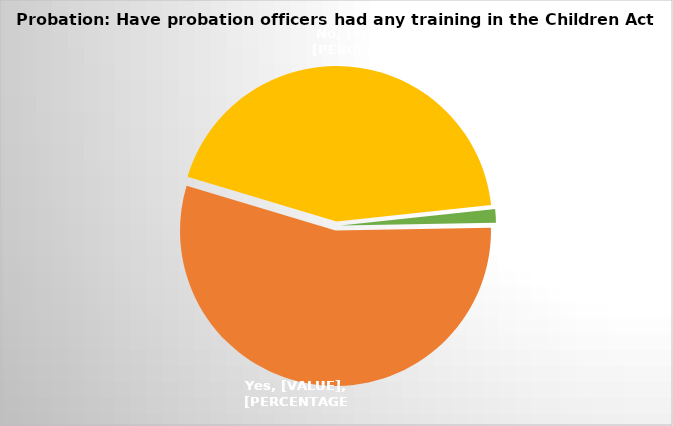
| Category | Series 1 | Series 0 |
|---|---|---|
| 0 | 39 | 48 |
| 1 | 31 | 183 |
| 2 | 1 | 6 |